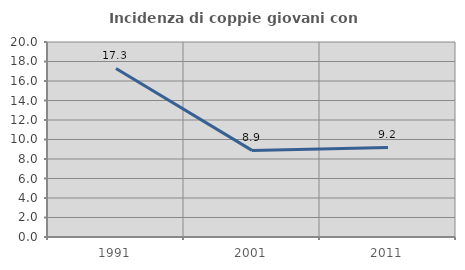
| Category | Incidenza di coppie giovani con figli |
|---|---|
| 1991.0 | 17.291 |
| 2001.0 | 8.882 |
| 2011.0 | 9.184 |